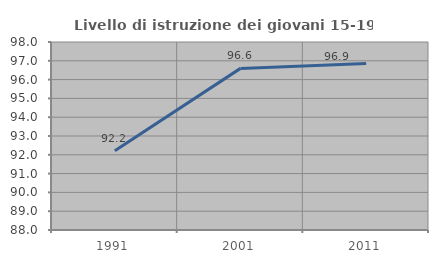
| Category | Livello di istruzione dei giovani 15-19 anni |
|---|---|
| 1991.0 | 92.217 |
| 2001.0 | 96.597 |
| 2011.0 | 96.86 |